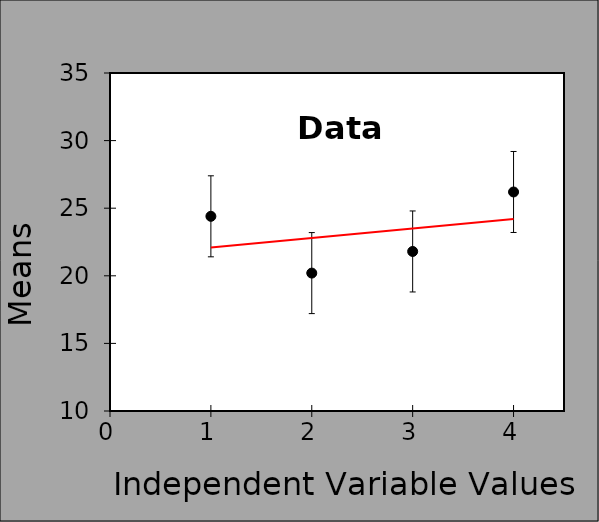
| Category | Data |
|---|---|
| 1.0 | 24.4 |
| 2.0 | 20.2 |
| 3.0 | 21.8 |
| 4.0 | 26.2 |